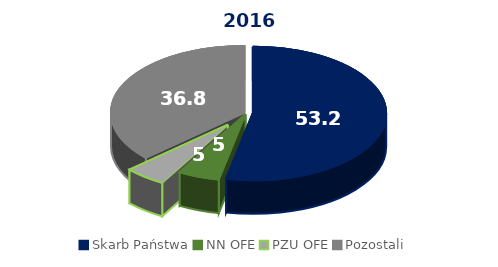
| Category | Series 0 |
|---|---|
| Skarb Państwa | 53.2 |
| NN OFE | 5 |
| PZU OFE | 5 |
| Pozostali | 36.78 |